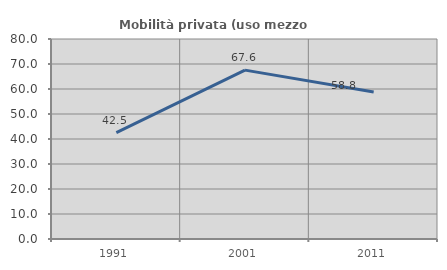
| Category | Mobilità privata (uso mezzo privato) |
|---|---|
| 1991.0 | 42.529 |
| 2001.0 | 67.553 |
| 2011.0 | 58.776 |